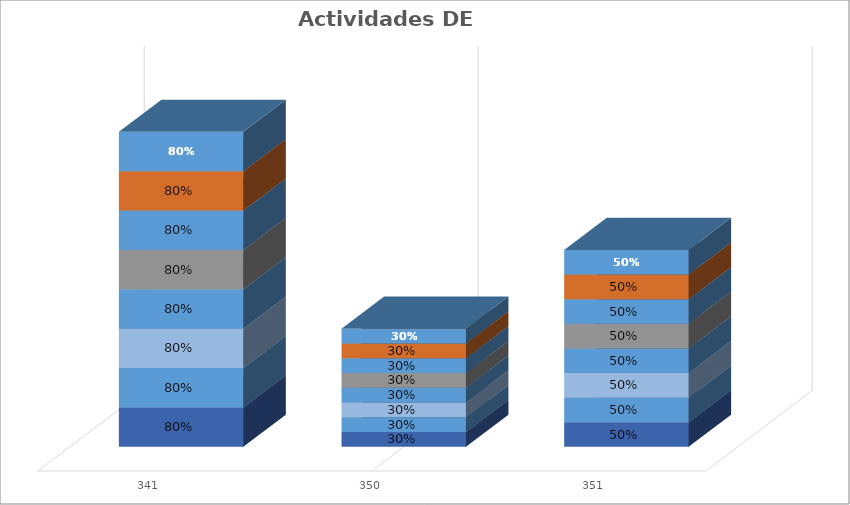
| Category | % Avance |
|---|---|
| 341.0 | 0.8 |
| 350.0 | 0.3 |
| 351.0 | 0.5 |